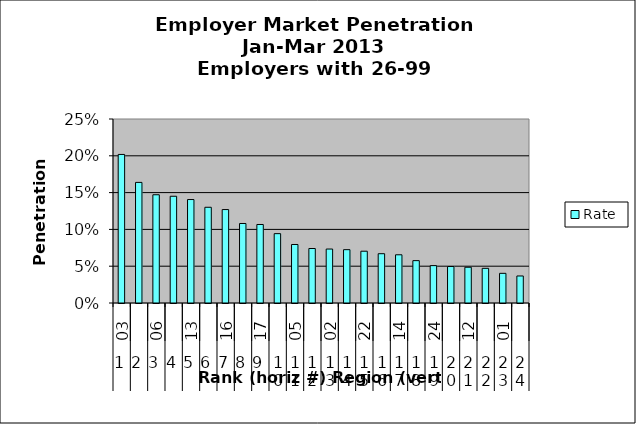
| Category | Rate |
|---|---|
| 0 | 0.202 |
| 1 | 0.164 |
| 2 | 0.147 |
| 3 | 0.145 |
| 4 | 0.141 |
| 5 | 0.13 |
| 6 | 0.127 |
| 7 | 0.108 |
| 8 | 0.107 |
| 9 | 0.094 |
| 10 | 0.08 |
| 11 | 0.074 |
| 12 | 0.073 |
| 13 | 0.072 |
| 14 | 0.07 |
| 15 | 0.067 |
| 16 | 0.066 |
| 17 | 0.058 |
| 18 | 0.051 |
| 19 | 0.05 |
| 20 | 0.049 |
| 21 | 0.047 |
| 22 | 0.04 |
| 23 | 0.037 |